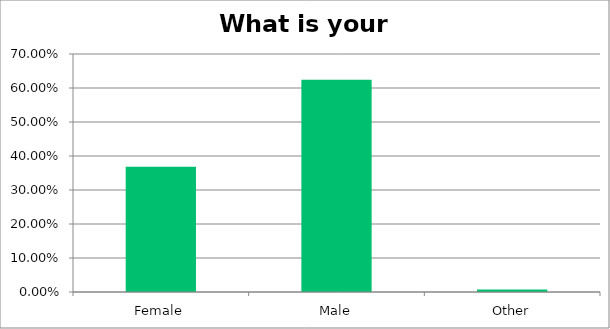
| Category | Responses |
|---|---|
| Female | 0.368 |
| Male | 0.625 |
| Other | 0.007 |